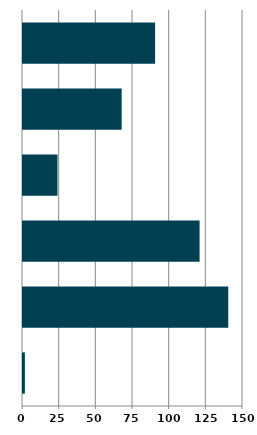
| Category | Series 0 |
|---|---|
| 0 | 1.288 |
| 1 | 139.948 |
| 2 | 120.399 |
| 3 | 23.528 |
| 4 | 67.275 |
| 5 | 90.078 |